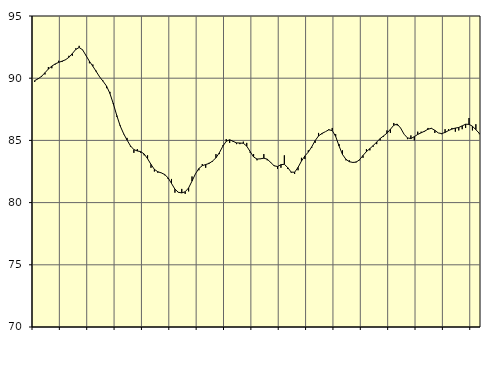
| Category | Piggar | Series 1 |
|---|---|---|
| nan | 89.7 | 89.81 |
| 87.0 | 90 | 89.95 |
| 87.0 | 90.1 | 90.15 |
| 87.0 | 90.3 | 90.44 |
| nan | 90.9 | 90.74 |
| 88.0 | 90.8 | 90.97 |
| 88.0 | 91.1 | 91.15 |
| 88.0 | 91.4 | 91.27 |
| nan | 91.3 | 91.37 |
| 89.0 | 91.5 | 91.48 |
| 89.0 | 91.8 | 91.68 |
| 89.0 | 91.8 | 91.98 |
| nan | 92.4 | 92.31 |
| 90.0 | 92.6 | 92.47 |
| 90.0 | 92.3 | 92.28 |
| 90.0 | 91.8 | 91.82 |
| nan | 91.2 | 91.36 |
| 91.0 | 91.1 | 90.96 |
| 91.0 | 90.6 | 90.53 |
| 91.0 | 90.1 | 90.1 |
| nan | 89.8 | 89.75 |
| 92.0 | 89.2 | 89.37 |
| 92.0 | 88.9 | 88.77 |
| 92.0 | 88 | 87.93 |
| nan | 86.9 | 87 |
| 93.0 | 86.2 | 86.16 |
| 93.0 | 85.5 | 85.54 |
| 93.0 | 85.2 | 85.03 |
| nan | 84.5 | 84.56 |
| 94.0 | 84 | 84.26 |
| 94.0 | 84.3 | 84.15 |
| 94.0 | 84 | 84.1 |
| nan | 83.8 | 83.91 |
| 95.0 | 83.8 | 83.53 |
| 95.0 | 82.8 | 83.07 |
| 95.0 | 82.5 | 82.67 |
| nan | 82.4 | 82.48 |
| 96.0 | 82.4 | 82.39 |
| 96.0 | 82.2 | 82.26 |
| 96.0 | 81.9 | 81.99 |
| nan | 81.9 | 81.54 |
| 97.0 | 80.8 | 81.08 |
| 97.0 | 80.8 | 80.83 |
| 97.0 | 81.1 | 80.78 |
| nan | 80.7 | 80.87 |
| 98.0 | 80.9 | 81.18 |
| 98.0 | 82.1 | 81.73 |
| 98.0 | 82.3 | 82.31 |
| nan | 82.6 | 82.74 |
| 99.0 | 83.1 | 82.97 |
| 99.0 | 82.8 | 83.06 |
| 99.0 | 83.2 | 83.15 |
| nan | 83.3 | 83.34 |
| 0.0 | 83.9 | 83.6 |
| 0.0 | 83.9 | 84.01 |
| 0.0 | 84.6 | 84.53 |
| nan | 85.1 | 84.93 |
| 1.0 | 84.8 | 85.05 |
| 1.0 | 84.9 | 84.93 |
| 1.0 | 84.7 | 84.8 |
| nan | 84.7 | 84.79 |
| 2.0 | 84.9 | 84.77 |
| 2.0 | 84.8 | 84.54 |
| 2.0 | 84 | 84.1 |
| nan | 83.9 | 83.67 |
| 3.0 | 83.4 | 83.5 |
| 3.0 | 83.5 | 83.52 |
| 3.0 | 83.9 | 83.57 |
| nan | 83.4 | 83.49 |
| 4.0 | 83.2 | 83.23 |
| 4.0 | 83 | 82.96 |
| 4.0 | 82.7 | 82.9 |
| nan | 82.8 | 83.05 |
| 5.0 | 83.8 | 83.08 |
| 5.0 | 82.7 | 82.81 |
| 5.0 | 82.4 | 82.45 |
| nan | 82.3 | 82.44 |
| 6.0 | 82.6 | 82.83 |
| 6.0 | 83.6 | 83.34 |
| 6.0 | 83.5 | 83.75 |
| nan | 84.2 | 84.06 |
| 7.0 | 84.4 | 84.48 |
| 7.0 | 84.8 | 84.98 |
| 7.0 | 85.6 | 85.36 |
| nan | 85.5 | 85.56 |
| 8.0 | 85.7 | 85.7 |
| 8.0 | 85.9 | 85.85 |
| 8.0 | 86 | 85.79 |
| nan | 85.5 | 85.32 |
| 9.0 | 84.7 | 84.55 |
| 9.0 | 84.2 | 83.87 |
| 9.0 | 83.4 | 83.48 |
| nan | 83.4 | 83.29 |
| 10.0 | 83.2 | 83.23 |
| 10.0 | 83.3 | 83.25 |
| 10.0 | 83.4 | 83.45 |
| nan | 83.6 | 83.79 |
| 11.0 | 84.3 | 84.1 |
| 11.0 | 84.2 | 84.34 |
| 11.0 | 84.5 | 84.59 |
| nan | 84.7 | 84.87 |
| 12.0 | 85 | 85.15 |
| 12.0 | 85.3 | 85.36 |
| 12.0 | 85.8 | 85.58 |
| nan | 85.6 | 85.89 |
| 13.0 | 86.4 | 86.22 |
| 13.0 | 86.2 | 86.31 |
| 13.0 | 86 | 85.99 |
| nan | 85.5 | 85.5 |
| 14.0 | 85.1 | 85.2 |
| 14.0 | 85.4 | 85.15 |
| 14.0 | 85 | 85.3 |
| nan | 85.7 | 85.48 |
| 15.0 | 85.7 | 85.61 |
| 15.0 | 85.7 | 85.74 |
| 15.0 | 86 | 85.9 |
| nan | 86 | 85.97 |
| 16.0 | 85.6 | 85.81 |
| 16.0 | 85.6 | 85.6 |
| 16.0 | 85.5 | 85.55 |
| nan | 85.9 | 85.64 |
| 17.0 | 85.9 | 85.79 |
| 17.0 | 86 | 85.91 |
| 17.0 | 85.7 | 85.99 |
| nan | 85.8 | 86.04 |
| 18.0 | 85.9 | 86.17 |
| 18.0 | 86 | 86.3 |
| 18.0 | 86.8 | 86.29 |
| nan | 85.8 | 86.14 |
| 19.0 | 86.3 | 85.86 |
| 19.0 | 85.5 | 85.57 |